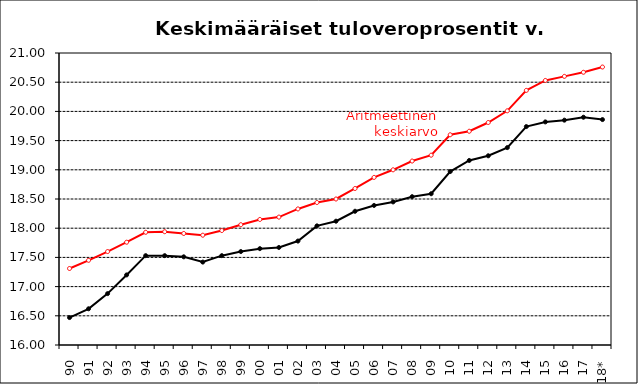
| Category | Series 2 | Series 3 |
|---|---|---|
| 90 | 16.47 | 17.31 |
| 91 | 16.62 | 17.45 |
| 92 | 16.88 | 17.6 |
| 93 | 17.2 | 17.76 |
| 94 | 17.53 | 17.93 |
| 95 | 17.53 | 17.94 |
| 96 | 17.51 | 17.91 |
| 97 | 17.42 | 17.88 |
| 98 | 17.53 | 17.96 |
| 99 | 17.6 | 18.06 |
| 00 | 17.65 | 18.15 |
| 01 | 17.67 | 18.19 |
| 02 | 17.78 | 18.33 |
| 03 | 18.04 | 18.44 |
| 04 | 18.12 | 18.5 |
| 05 | 18.29 | 18.68 |
| 06 | 18.39 | 18.87 |
| 07 | 18.45 | 19 |
| 08 | 18.54 | 19.15 |
| 09 | 18.59 | 19.25 |
| 10 | 18.97 | 19.6 |
| 11 | 19.16 | 19.66 |
| 12 | 19.24 | 19.81 |
| 13 | 19.38 | 20.01 |
| 14 | 19.74 | 20.36 |
| 15 | 19.82 | 20.53 |
| 16 | 19.85 | 20.6 |
| 17 | 19.9 | 20.67 |
| 18* | 19.86 | 20.76 |